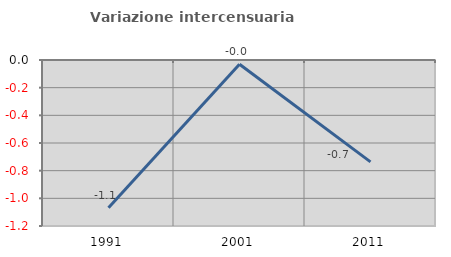
| Category | Variazione intercensuaria annua |
|---|---|
| 1991.0 | -1.067 |
| 2001.0 | -0.031 |
| 2011.0 | -0.737 |